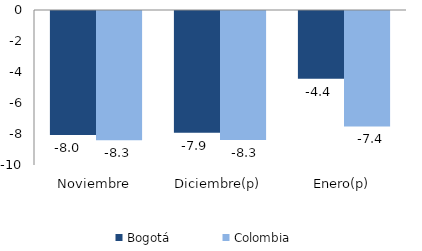
| Category | Bogotá | Colombia |
|---|---|---|
| Noviembre | -8.006 | -8.339 |
| Diciembre(p) | -7.86 | -8.328 |
| Enero(p) | -4.365 | -7.447 |